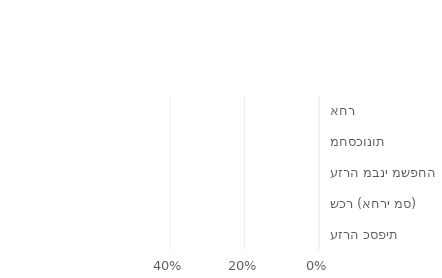
| Category | Series 0 |
|---|---|
| עזרה כספית | 0 |
| שכר (אחרי מס) | 0 |
| עזרה מבני משפחה | 0 |
| מחסכונות | 0 |
| אחר | 0 |